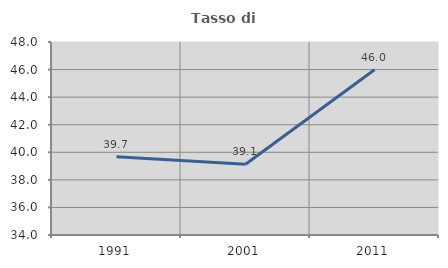
| Category | Tasso di occupazione   |
|---|---|
| 1991.0 | 39.672 |
| 2001.0 | 39.132 |
| 2011.0 | 45.984 |